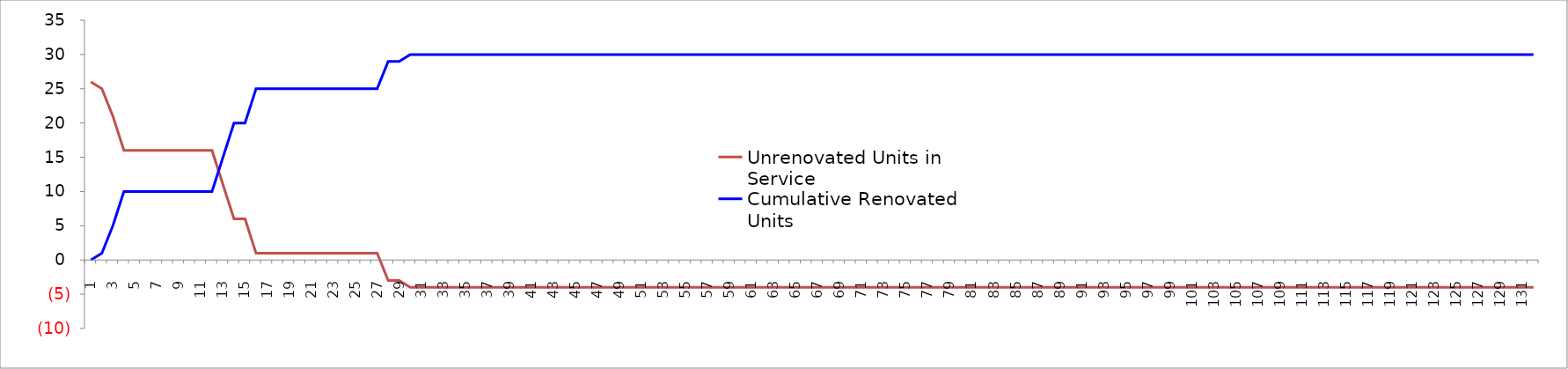
| Category | Unrenovated Units in Service | Cumulative Renovated Units |
|---|---|---|
| 1.0 | 26 | 0 |
| 2.0 | 25 | 1 |
| 3.0 | 21 | 5 |
| 4.0 | 16 | 10 |
| 5.0 | 16 | 10 |
| 6.0 | 16 | 10 |
| 7.0 | 16 | 10 |
| 8.0 | 16 | 10 |
| 9.0 | 16 | 10 |
| 10.0 | 16 | 10 |
| 11.0 | 16 | 10 |
| 12.0 | 16 | 10 |
| 13.0 | 11 | 15 |
| 14.0 | 6 | 20 |
| 15.0 | 6 | 20 |
| 16.0 | 1 | 25 |
| 17.0 | 1 | 25 |
| 18.0 | 1 | 25 |
| 19.0 | 1 | 25 |
| 20.0 | 1 | 25 |
| 21.0 | 1 | 25 |
| 22.0 | 1 | 25 |
| 23.0 | 1 | 25 |
| 24.0 | 1 | 25 |
| 25.0 | 1 | 25 |
| 26.0 | 1 | 25 |
| 27.0 | 1 | 25 |
| 28.0 | -3 | 29 |
| 29.0 | -3 | 29 |
| 30.0 | -4 | 30 |
| 31.0 | -4 | 30 |
| 32.0 | -4 | 30 |
| 33.0 | -4 | 30 |
| 34.0 | -4 | 30 |
| 35.0 | -4 | 30 |
| 36.0 | -4 | 30 |
| 37.0 | -4 | 30 |
| 38.0 | -4 | 30 |
| 39.0 | -4 | 30 |
| 40.0 | -4 | 30 |
| 41.0 | -4 | 30 |
| 42.0 | -4 | 30 |
| 43.0 | -4 | 30 |
| 44.0 | -4 | 30 |
| 45.0 | -4 | 30 |
| 46.0 | -4 | 30 |
| 47.0 | -4 | 30 |
| 48.0 | -4 | 30 |
| 49.0 | -4 | 30 |
| 50.0 | -4 | 30 |
| 51.0 | -4 | 30 |
| 52.0 | -4 | 30 |
| 53.0 | -4 | 30 |
| 54.0 | -4 | 30 |
| 55.0 | -4 | 30 |
| 56.0 | -4 | 30 |
| 57.0 | -4 | 30 |
| 58.0 | -4 | 30 |
| 59.0 | -4 | 30 |
| 60.0 | -4 | 30 |
| 61.0 | -4 | 30 |
| 62.0 | -4 | 30 |
| 63.0 | -4 | 30 |
| 64.0 | -4 | 30 |
| 65.0 | -4 | 30 |
| 66.0 | -4 | 30 |
| 67.0 | -4 | 30 |
| 68.0 | -4 | 30 |
| 69.0 | -4 | 30 |
| 70.0 | -4 | 30 |
| 71.0 | -4 | 30 |
| 72.0 | -4 | 30 |
| 73.0 | -4 | 30 |
| 74.0 | -4 | 30 |
| 75.0 | -4 | 30 |
| 76.0 | -4 | 30 |
| 77.0 | -4 | 30 |
| 78.0 | -4 | 30 |
| 79.0 | -4 | 30 |
| 80.0 | -4 | 30 |
| 81.0 | -4 | 30 |
| 82.0 | -4 | 30 |
| 83.0 | -4 | 30 |
| 84.0 | -4 | 30 |
| 85.0 | -4 | 30 |
| 86.0 | -4 | 30 |
| 87.0 | -4 | 30 |
| 88.0 | -4 | 30 |
| 89.0 | -4 | 30 |
| 90.0 | -4 | 30 |
| 91.0 | -4 | 30 |
| 92.0 | -4 | 30 |
| 93.0 | -4 | 30 |
| 94.0 | -4 | 30 |
| 95.0 | -4 | 30 |
| 96.0 | -4 | 30 |
| 97.0 | -4 | 30 |
| 98.0 | -4 | 30 |
| 99.0 | -4 | 30 |
| 100.0 | -4 | 30 |
| 101.0 | -4 | 30 |
| 102.0 | -4 | 30 |
| 103.0 | -4 | 30 |
| 104.0 | -4 | 30 |
| 105.0 | -4 | 30 |
| 106.0 | -4 | 30 |
| 107.0 | -4 | 30 |
| 108.0 | -4 | 30 |
| 109.0 | -4 | 30 |
| 110.0 | -4 | 30 |
| 111.0 | -4 | 30 |
| 112.0 | -4 | 30 |
| 113.0 | -4 | 30 |
| 114.0 | -4 | 30 |
| 115.0 | -4 | 30 |
| 116.0 | -4 | 30 |
| 117.0 | -4 | 30 |
| 118.0 | -4 | 30 |
| 119.0 | -4 | 30 |
| 120.0 | -4 | 30 |
| 121.0 | -4 | 30 |
| 122.0 | -4 | 30 |
| 123.0 | -4 | 30 |
| 124.0 | -4 | 30 |
| 125.0 | -4 | 30 |
| 126.0 | -4 | 30 |
| 127.0 | -4 | 30 |
| 128.0 | -4 | 30 |
| 129.0 | -4 | 30 |
| 130.0 | -4 | 30 |
| 131.0 | -4 | 30 |
| 132.0 | -4 | 30 |